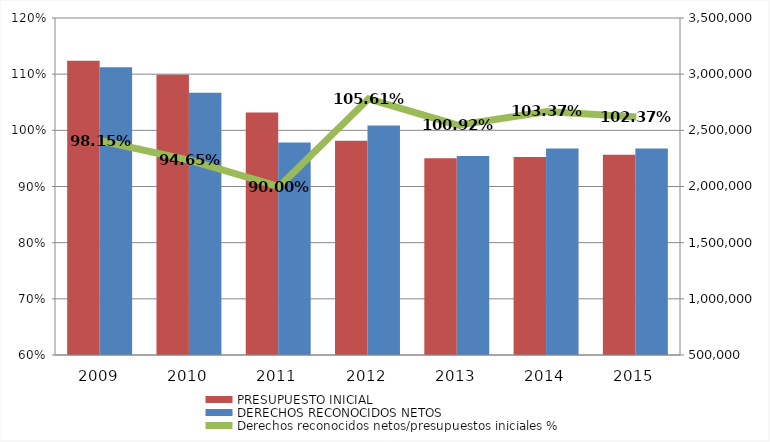
| Category | PRESUPUESTO INICIAL | DERECHOS RECONOCIDOS NETOS |
|---|---|---|
| 2009.0 | 3119192.039 | 3061409.44 |
| 2010.0 | 2993809.334 | 2833638.064 |
| 2011.0 | 2658404.732 | 2392480.632 |
| 2012.0 | 2407218.064 | 2542189.167 |
| 2013.0 | 2251494.132 | 2272108.92 |
| 2014.0 | 2262738.711 | 2338899.754 |
| 2015.0 | 2283050.748 | 2337248.453 |